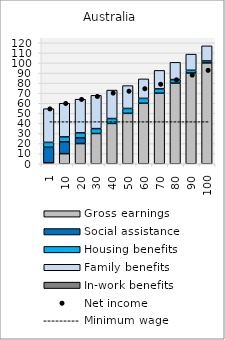
| Category | Gross earnings | Social assistance | Housing benefits | Family benefits | In-work benefits |
|---|---|---|---|---|---|
| 1.0 | 1 | 15.344 | 4.858 | 33.441 | 0 |
| 10.0 | 10 | 11.759 | 4.858 | 33.441 | 0 |
| 20.0 | 20 | 5.758 | 4.858 | 33.441 | 0 |
| 30.0 | 30 | 0 | 4.858 | 33.029 | 0 |
| 40.0 | 40 | 0 | 4.858 | 28.229 | 0 |
| 50.0 | 50 | 0 | 4.858 | 22.682 | 0 |
| 60.0 | 60 | 0 | 4.858 | 19.343 | 0 |
| 70.0 | 70 | 0 | 4.255 | 18.364 | 0 |
| 80.0 | 80 | 0 | 3.492 | 17.126 | 0 |
| 90.0 | 90 | 0 | 2.73 | 16.034 | 0 |
| 100.0 | 100 | 0 | 1.968 | 15.022 | 0 |